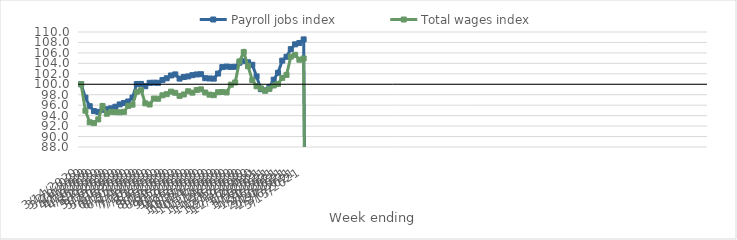
| Category | Payroll jobs index | Total wages index |
|---|---|---|
| 14/03/2020 | 100 | 100 |
| 21/03/2020 | 97.448 | 94.95 |
| 28/03/2020 | 95.809 | 92.722 |
| 04/04/2020 | 94.872 | 92.573 |
| 11/04/2020 | 94.711 | 93.278 |
| 18/04/2020 | 95.115 | 95.842 |
| 25/04/2020 | 95.227 | 94.361 |
| 02/05/2020 | 95.398 | 94.736 |
| 09/05/2020 | 95.704 | 94.686 |
| 16/05/2020 | 96.145 | 94.641 |
| 23/05/2020 | 96.427 | 94.72 |
| 30/05/2020 | 96.706 | 95.862 |
| 06/06/2020 | 97.453 | 96.103 |
| 13/06/2020 | 100.055 | 98.555 |
| 20/06/2020 | 100.068 | 98.866 |
| 27/06/2020 | 99.623 | 96.353 |
| 04/07/2020 | 100.276 | 96.128 |
| 11/07/2020 | 100.309 | 97.264 |
| 18/07/2020 | 100.285 | 97.235 |
| 25/07/2020 | 100.811 | 97.882 |
| 01/08/2020 | 101.148 | 98.107 |
| 08/08/2020 | 101.685 | 98.589 |
| 15/08/2020 | 101.889 | 98.37 |
| 22/08/2020 | 101.079 | 97.775 |
| 29/08/2020 | 101.384 | 98.053 |
| 05/09/2020 | 101.504 | 98.657 |
| 12/09/2020 | 101.744 | 98.399 |
| 19/09/2020 | 101.88 | 98.897 |
| 26/09/2020 | 101.928 | 99.03 |
| 03/10/2020 | 101.164 | 98.428 |
| 10/10/2020 | 101.108 | 98.016 |
| 17/10/2020 | 101.08 | 97.914 |
| 24/10/2020 | 102.052 | 98.477 |
| 31/10/2020 | 103.289 | 98.526 |
| 07/11/2020 | 103.385 | 98.439 |
| 14/11/2020 | 103.319 | 99.929 |
| 21/11/2020 | 103.346 | 100.348 |
| 28/11/2020 | 104.128 | 104.371 |
| 05/12/2020 | 104.414 | 106.155 |
| 12/12/2020 | 104.205 | 103.446 |
| 19/12/2020 | 103.73 | 100.789 |
| 26/12/2020 | 101.508 | 99.621 |
| 02/01/2021 | 99.053 | 99.218 |
| 09/01/2021 | 98.837 | 98.766 |
| 16/01/2021 | 99.481 | 99.109 |
| 23/01/2021 | 100.868 | 99.767 |
| 30/01/2021 | 102.203 | 100.057 |
| 06/02/2021 | 104.524 | 101.224 |
| 13/02/2021 | 105.259 | 101.794 |
| 20/02/2021 | 106.727 | 105.288 |
| 27/02/2021 | 107.641 | 105.634 |
| 06/03/2021 | 107.903 | 104.7 |
| 13/03/2021 | 108.585 | 104.94 |